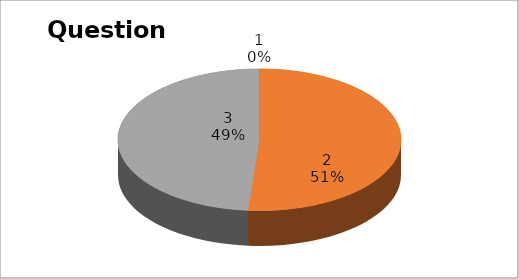
| Category | Series 0 |
|---|---|
| 0 | 0 |
| 1 | 20 |
| 2 | 19 |